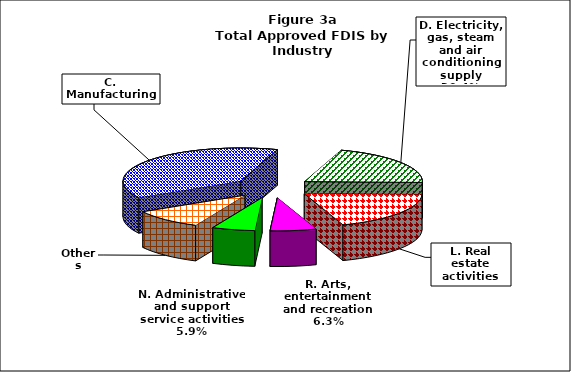
| Category | Series 0 |
|---|---|
| C. Manufacturing | 9603.044 |
| D. Electricity, gas, steam and air conditioning supply | 5099.592 |
| L. Real estate activities | 4819.878 |
| R. Arts, entertainment and recreation | 1583.438 |
| N. Administrative and support service activities | 1473.642 |
| Others | 2450.738 |